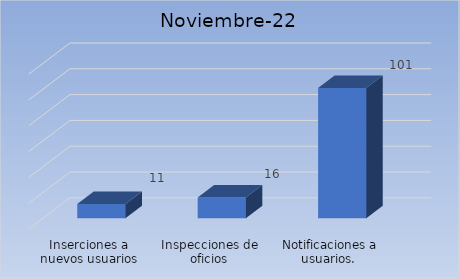
| Category | Cantidad |
|---|---|
| Inserciones a nuevos usuarios | 11 |
| Inspecciones de oficios | 16 |
| Notificaciones a usuarios.  | 101 |